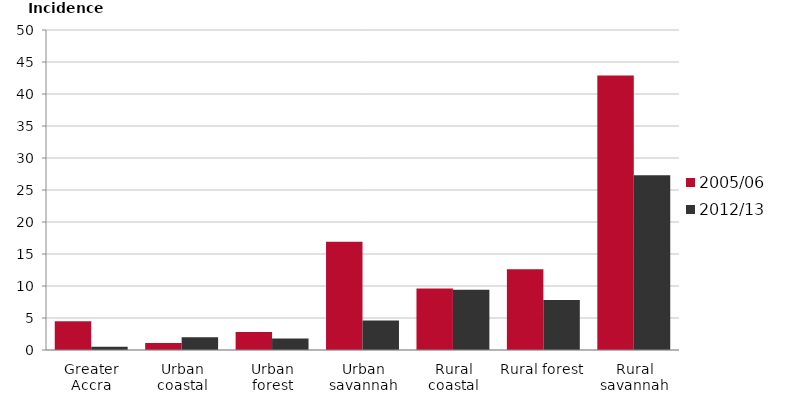
| Category | 2005/06 | 2012/13 |
|---|---|---|
| Greater Accra | 4.5 | 0.5 |
| Urban coastal | 1.1 | 2 |
| Urban forest | 2.8 | 1.8 |
| Urban savannah | 16.9 | 4.6 |
| Rural coastal | 9.6 | 9.4 |
| Rural forest | 12.6 | 7.8 |
| Rural savannah | 42.9 | 27.3 |